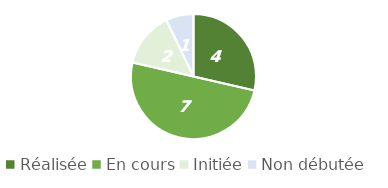
| Category | Series 0 |
|---|---|
| Réalisée | 4 |
| En cours | 7 |
| Initiée | 2 |
| Non débutée | 1 |